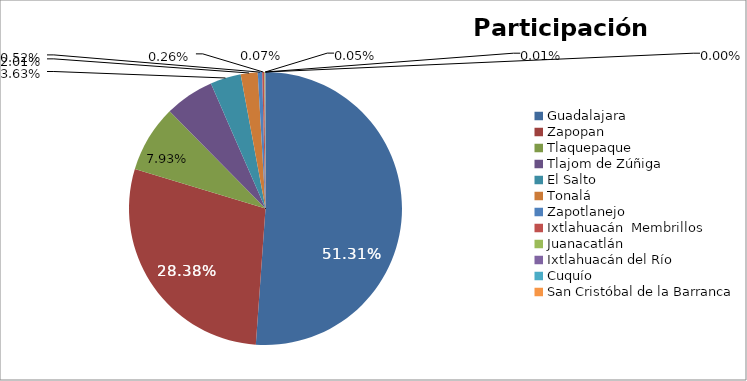
| Category | Series 0 |
|---|---|
| Guadalajara | 704369 |
| Zapopan | 393291 |
| Tlaquepaque | 109145 |
| Tlajom de Zúñiga | 80554 |
| El Salto | 50023 |
| Tonalá | 27705 |
| Zapotlanejo | 7196 |
| Ixtlahuacán  Membrillos | 3523 |
| Juanacatlán | 996 |
| Ixtlahuacán del Río | 596 |
| Cuquío | 166 |
| San Cristóbal de la Barranca | 22 |